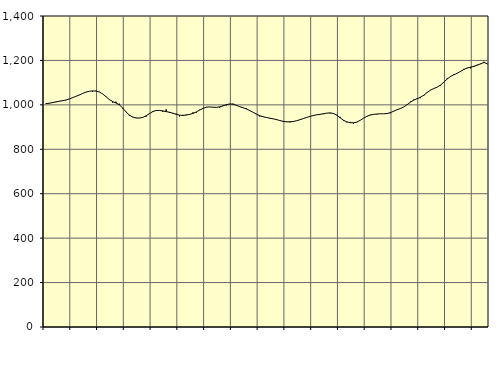
| Category | Piggar | Series 1 |
|---|---|---|
| nan | 1004.8 | 1005.51 |
| 87.0 | 1006.3 | 1007.26 |
| 87.0 | 1012.5 | 1010.03 |
| 87.0 | 1011.9 | 1013.34 |
| nan | 1016.5 | 1016.12 |
| 88.0 | 1019.9 | 1018.58 |
| 88.0 | 1020.4 | 1021.54 |
| 88.0 | 1026.1 | 1026.12 |
| nan | 1033.2 | 1032.2 |
| 89.0 | 1037.8 | 1038.21 |
| 89.0 | 1043.7 | 1044.15 |
| 89.0 | 1050.5 | 1050.85 |
| nan | 1058 | 1057.15 |
| 90.0 | 1061.3 | 1061.14 |
| 90.0 | 1059.1 | 1062.72 |
| 90.0 | 1063.6 | 1062.07 |
| nan | 1058.9 | 1058.08 |
| 91.0 | 1049.6 | 1049.64 |
| 91.0 | 1038.5 | 1037.22 |
| 91.0 | 1024.8 | 1024.09 |
| nan | 1010.1 | 1014.65 |
| 92.0 | 1014.7 | 1008.5 |
| 92.0 | 1005.3 | 1000.41 |
| 92.0 | 983.9 | 986.2 |
| nan | 969.5 | 968.64 |
| 93.0 | 951.6 | 954.05 |
| 93.0 | 946.1 | 944.99 |
| 93.0 | 941.9 | 941 |
| nan | 941.4 | 940.5 |
| 94.0 | 942.5 | 943.37 |
| 94.0 | 946.7 | 950.44 |
| 94.0 | 961.9 | 960.38 |
| nan | 967.7 | 969.74 |
| 95.0 | 976.5 | 974.57 |
| 95.0 | 975.6 | 974.82 |
| 95.0 | 968.8 | 972.82 |
| nan | 979.9 | 969.72 |
| 96.0 | 963.7 | 966.71 |
| 96.0 | 961.3 | 962.6 |
| 96.0 | 960.4 | 957.45 |
| nan | 947.8 | 953.65 |
| 97.0 | 955 | 952.32 |
| 97.0 | 956.2 | 954.07 |
| 97.0 | 955.9 | 957.08 |
| nan | 966.2 | 961.3 |
| 98.0 | 964.8 | 967.96 |
| 98.0 | 977.8 | 976.19 |
| 98.0 | 985.8 | 984.06 |
| nan | 990.5 | 989.47 |
| 99.0 | 990.5 | 990.64 |
| 99.0 | 989.4 | 989.43 |
| 99.0 | 988.8 | 988.86 |
| nan | 987.2 | 990.88 |
| 0.0 | 997.7 | 995.38 |
| 0.0 | 997.4 | 1000.78 |
| 0.0 | 1002.8 | 1004.08 |
| nan | 1005.5 | 1002.96 |
| 1.0 | 996.5 | 997.92 |
| 1.0 | 993.4 | 991.99 |
| 1.0 | 987.9 | 987.09 |
| nan | 984.8 | 981.61 |
| 2.0 | 973.7 | 974.58 |
| 2.0 | 966.1 | 966.24 |
| 2.0 | 959.3 | 957.79 |
| nan | 947.3 | 950.95 |
| 3.0 | 947.2 | 946.34 |
| 3.0 | 943.5 | 943.02 |
| 3.0 | 938.5 | 939.9 |
| nan | 936.5 | 937.07 |
| 4.0 | 931.6 | 933.67 |
| 4.0 | 929.2 | 929.4 |
| 4.0 | 923.6 | 925.66 |
| nan | 925.2 | 923.67 |
| 5.0 | 921.1 | 923.8 |
| 5.0 | 926.3 | 925.28 |
| 5.0 | 928.8 | 928.47 |
| nan | 932.4 | 933.1 |
| 6.0 | 937.7 | 938.26 |
| 6.0 | 944 | 943.36 |
| 6.0 | 948.2 | 947.87 |
| nan | 950.9 | 952.06 |
| 7.0 | 955.9 | 955.2 |
| 7.0 | 955.7 | 957.35 |
| 7.0 | 958.1 | 959.97 |
| nan | 963.4 | 962.69 |
| 8.0 | 961.8 | 963.87 |
| 8.0 | 959.5 | 961.27 |
| 8.0 | 955.2 | 953.58 |
| nan | 945.8 | 942.27 |
| 9.0 | 927.4 | 930.68 |
| 9.0 | 921.3 | 923.42 |
| 9.0 | 923.2 | 919.83 |
| nan | 914.3 | 919.07 |
| 10.0 | 921.8 | 922.42 |
| 10.0 | 929.9 | 930.3 |
| 10.0 | 940.1 | 940.01 |
| nan | 948.7 | 948.38 |
| 11.0 | 955.2 | 954.02 |
| 11.0 | 956.2 | 957.02 |
| 11.0 | 957.4 | 958.66 |
| nan | 959.6 | 959.64 |
| 12.0 | 959.7 | 959.79 |
| 12.0 | 959.4 | 960.88 |
| 12.0 | 962.2 | 964.83 |
| nan | 972.5 | 971.41 |
| 13.0 | 978.3 | 978.11 |
| 13.0 | 984.6 | 983.55 |
| 13.0 | 990.3 | 990.49 |
| nan | 1000.4 | 1000.43 |
| 14.0 | 1014.2 | 1011.82 |
| 14.0 | 1023.8 | 1021.3 |
| 14.0 | 1029.2 | 1027.67 |
| nan | 1030.3 | 1034.1 |
| 15.0 | 1040.9 | 1043.48 |
| 15.0 | 1054.3 | 1055.47 |
| 15.0 | 1067.1 | 1066.07 |
| nan | 1073.4 | 1073.59 |
| 16.0 | 1079.5 | 1079.75 |
| 16.0 | 1086.7 | 1088.95 |
| 16.0 | 1102.7 | 1102.06 |
| nan | 1119 | 1116.15 |
| 17.0 | 1125.4 | 1127.77 |
| 17.0 | 1138.4 | 1135.59 |
| 17.0 | 1141.4 | 1142.28 |
| nan | 1149.4 | 1150.85 |
| 18.0 | 1162 | 1159.5 |
| 18.0 | 1167 | 1165.89 |
| 18.0 | 1164.3 | 1169.73 |
| nan | 1175.3 | 1173.26 |
| 19.0 | 1180.6 | 1178.6 |
| 19.0 | 1183.3 | 1184.72 |
| 19.0 | 1194.1 | 1190.94 |
| nan | 1183.3 | 1184.57 |